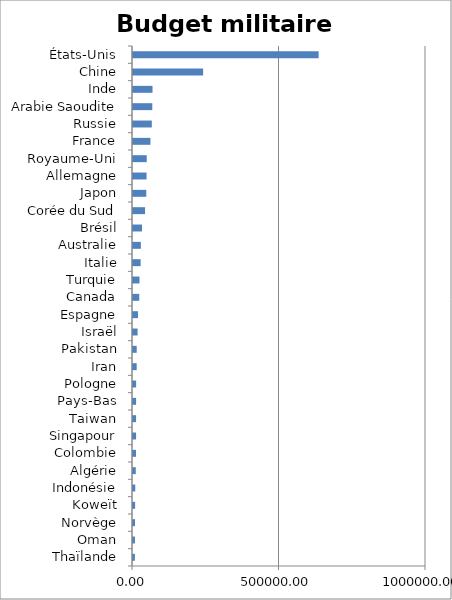
| Category | Budget militaire 2018 |
|---|---|
| Thaïlande | 6420 |
| Oman | 6611 |
| Norvège | 6824 |
| Koweït | 7211 |
| Indonésie | 7661 |
| Algérie | 9459 |
| Colombie | 10303 |
| Singapour | 10458 |
| Taiwan | 10458 |
| Pays-Bas | 10535 |
| Pologne | 10749 |
| Iran | 12612 |
| Pakistan | 12686 |
| Israël | 15690 |
| Espagne | 17039 |
| Canada | 21352 |
| Turquie | 22088 |
| Italie | 26082 |
| Australie | 26836 |
| Brésil | 30769 |
| Corée du Sud | 41157 |
| Japon | 45362 |
| Allemagne | 46192 |
| Royaume-Uni | 46883 |
| France | 59542 |
| Russie | 64193 |
| Arabie Saoudite | 65843 |
| Inde | 66578 |
| Chine | 239223 |
| États-Unis | 633565 |